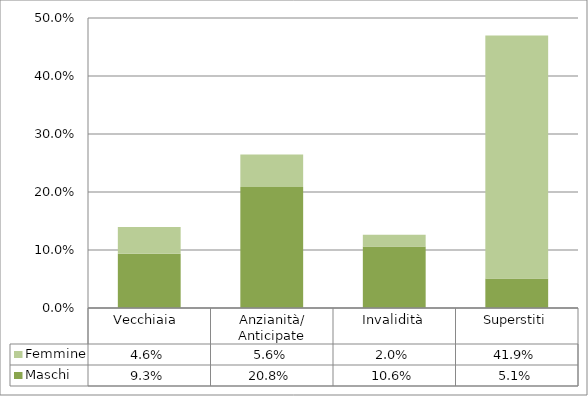
| Category | Maschi | Femmine |
|---|---|---|
| Vecchiaia  | 0.093 | 0.046 |
| Anzianità/ Anticipate | 0.208 | 0.056 |
| Invalidità | 0.106 | 0.02 |
| Superstiti | 0.051 | 0.419 |